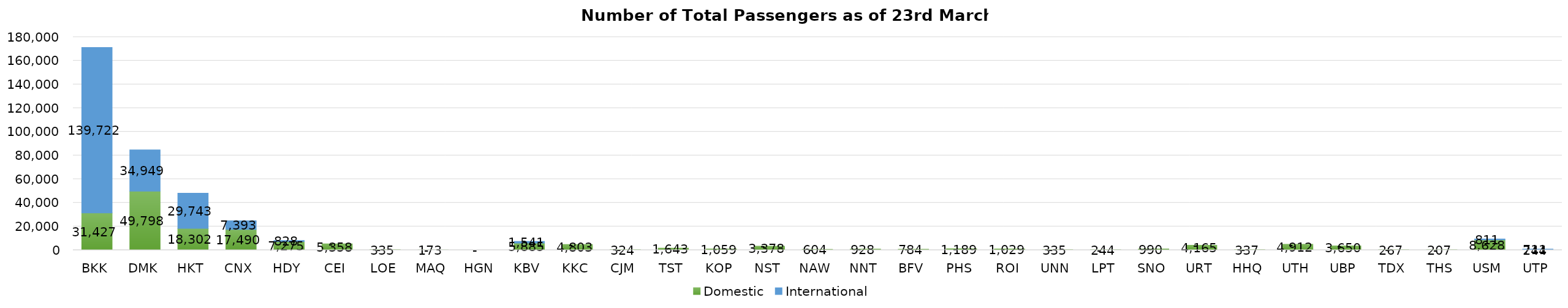
| Category | Domestic | International |
|---|---|---|
| BKK | 31427 | 139722 |
| DMK | 49798 | 34949 |
| HKT | 18302 | 29743 |
| CNX | 17490 | 7393 |
| HDY | 7275 | 828 |
| CEI | 5358 | 0 |
| LOE | 335 | 0 |
| MAQ | 173 | 0 |
| HGN | 0 | 0 |
| KBV | 5885 | 1541 |
| KKC | 4803 | 0 |
| CJM | 324 | 0 |
| TST | 1643 | 0 |
| KOP | 1059 | 0 |
| NST | 3378 | 0 |
| NAW | 604 | 0 |
| NNT | 928 | 0 |
| BFV | 784 | 0 |
| PHS | 1189 | 0 |
| ROI | 1029 | 0 |
| UNN | 335 | 0 |
| LPT | 244 | 0 |
| SNO | 990 | 0 |
| URT | 4165 | 0 |
| HHQ | 337 | 0 |
| UTH | 4912 | 0 |
| UBP | 3650 | 0 |
| TDX | 267 | 0 |
| THS | 207 | 0 |
| USM | 8628 | 811 |
| UTP | 244 | 711 |